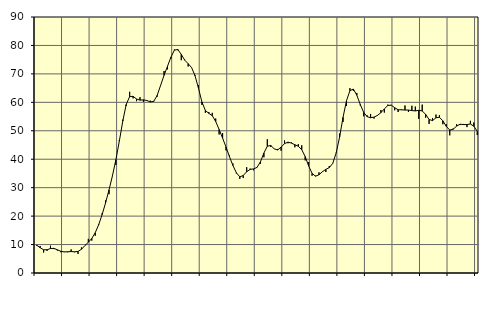
| Category | Piggar | Series 1 |
|---|---|---|
| nan | 9.5 | 9.77 |
| 87.0 | 9.5 | 8.88 |
| 87.0 | 7.2 | 8.17 |
| 87.0 | 7.8 | 8.17 |
| nan | 9.6 | 8.6 |
| 88.0 | 8.4 | 8.66 |
| 88.0 | 7.9 | 8.16 |
| 88.0 | 7.3 | 7.64 |
| nan | 7.5 | 7.4 |
| 89.0 | 7.3 | 7.47 |
| 89.0 | 8.3 | 7.54 |
| 89.0 | 7.3 | 7.45 |
| nan | 6.7 | 7.58 |
| 90.0 | 9 | 8.34 |
| 90.0 | 9.7 | 9.63 |
| 90.0 | 12 | 10.82 |
| nan | 11.4 | 12.14 |
| 91.0 | 13.1 | 14.15 |
| 91.0 | 17.2 | 16.98 |
| 91.0 | 21 | 20.53 |
| nan | 25.5 | 24.63 |
| 92.0 | 27.7 | 29.2 |
| 92.0 | 34.3 | 34.16 |
| 92.0 | 38 | 39.82 |
| nan | 46.7 | 46.35 |
| 93.0 | 53.9 | 53.38 |
| 93.0 | 58.7 | 59.24 |
| 93.0 | 63.7 | 62.02 |
| nan | 61.4 | 62.11 |
| 94.0 | 60.4 | 61.18 |
| 94.0 | 61.8 | 60.77 |
| 94.0 | 60.2 | 60.88 |
| nan | 60.8 | 60.64 |
| 95.0 | 60.6 | 60.13 |
| 95.0 | 60.5 | 60.33 |
| 95.0 | 62 | 62.44 |
| nan | 65.9 | 65.99 |
| 96.0 | 71 | 69.5 |
| 96.0 | 71.6 | 72.68 |
| 96.0 | 75.4 | 75.91 |
| nan | 78.6 | 78.34 |
| 97.0 | 78.3 | 78.59 |
| 97.0 | 74.8 | 76.85 |
| 97.0 | 75 | 74.83 |
| nan | 72.6 | 73.58 |
| 98.0 | 72.3 | 72.22 |
| 98.0 | 69.6 | 69.35 |
| 98.0 | 66 | 64.94 |
| nan | 59.1 | 60.13 |
| 99.0 | 56.3 | 57.14 |
| 99.0 | 56.6 | 56.12 |
| 99.0 | 56.3 | 55.31 |
| nan | 54.3 | 53.27 |
| 0.0 | 48.7 | 50.46 |
| 0.0 | 49.2 | 47.44 |
| 0.0 | 43.1 | 44.29 |
| nan | 41.3 | 40.9 |
| 1.0 | 38.5 | 37.79 |
| 1.0 | 35 | 35.26 |
| 1.0 | 33.1 | 33.81 |
| nan | 33.4 | 34.27 |
| 2.0 | 37.2 | 35.61 |
| 2.0 | 36.7 | 36.43 |
| 2.0 | 36.1 | 36.6 |
| nan | 37.2 | 37.12 |
| 3.0 | 38.4 | 39.1 |
| 3.0 | 40.7 | 42.17 |
| 3.0 | 47 | 44.57 |
| nan | 44.3 | 44.83 |
| 4.0 | 43.7 | 43.65 |
| 4.0 | 43.6 | 43.26 |
| 4.0 | 43 | 44.25 |
| nan | 46.6 | 45.49 |
| 5.0 | 45.6 | 46.01 |
| 5.0 | 45.9 | 45.67 |
| 5.0 | 44.2 | 45.1 |
| nan | 45.3 | 44.55 |
| 6.0 | 44.9 | 43.35 |
| 6.0 | 39.6 | 40.95 |
| 6.0 | 39 | 37.66 |
| nan | 34.2 | 35.03 |
| 7.0 | 34.2 | 34.03 |
| 7.0 | 35.4 | 34.53 |
| 7.0 | 35.5 | 35.61 |
| nan | 35.5 | 36.44 |
| 8.0 | 37.6 | 37.04 |
| 8.0 | 38.6 | 38.52 |
| 8.0 | 42.3 | 42.19 |
| nan | 49 | 47.79 |
| 9.0 | 53.1 | 54.73 |
| 9.0 | 58.7 | 60.56 |
| 9.0 | 65 | 64.09 |
| nan | 64 | 64.67 |
| 10.0 | 63.3 | 62.5 |
| 10.0 | 58.9 | 59.26 |
| 10.0 | 55.1 | 56.45 |
| nan | 55.4 | 54.96 |
| 11.0 | 55.9 | 54.59 |
| 11.0 | 54.3 | 54.8 |
| 11.0 | 55.3 | 55.41 |
| nan | 57.3 | 56.36 |
| 12.0 | 56.4 | 57.69 |
| 12.0 | 59.2 | 58.88 |
| 12.0 | 59.1 | 59.02 |
| nan | 57.2 | 58.1 |
| 13.0 | 56.6 | 57.4 |
| 13.0 | 57.5 | 57.37 |
| 13.0 | 58.9 | 57.29 |
| nan | 56.6 | 57.29 |
| 14.0 | 58.8 | 57.1 |
| 14.0 | 58.5 | 56.98 |
| 14.0 | 54.2 | 57.2 |
| nan | 59.2 | 56.97 |
| 15.0 | 54.6 | 55.76 |
| 15.0 | 52.4 | 53.98 |
| 15.0 | 54.5 | 53.58 |
| nan | 55.7 | 54.57 |
| 16.0 | 55.5 | 54.74 |
| 16.0 | 52.3 | 53.51 |
| 16.0 | 52.3 | 51.54 |
| nan | 48.4 | 50.26 |
| 17.0 | 50.8 | 50.54 |
| 17.0 | 52.3 | 51.64 |
| 17.0 | 52 | 52.31 |
| nan | 52.4 | 52.18 |
| 18.0 | 51.3 | 52.2 |
| 18.0 | 53.5 | 52.38 |
| 18.0 | 52.9 | 51.61 |
| nan | 48.5 | 49.81 |